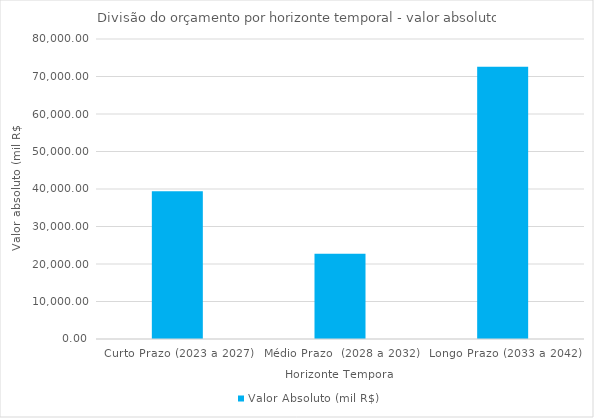
| Category | Valor Absoluto (mil R$) |
|---|---|
| Curto Prazo (2023 a 2027) | 39416.549 |
| Médio Prazo  (2028 a 2032) | 22732.839 |
| Longo Prazo (2033 a 2042) | 72572.912 |